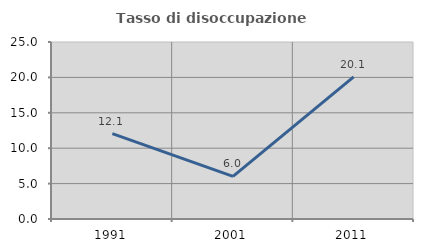
| Category | Tasso di disoccupazione giovanile  |
|---|---|
| 1991.0 | 12.067 |
| 2001.0 | 6.015 |
| 2011.0 | 20.081 |